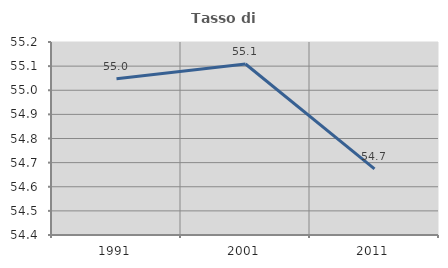
| Category | Tasso di occupazione   |
|---|---|
| 1991.0 | 55.047 |
| 2001.0 | 55.109 |
| 2011.0 | 54.674 |